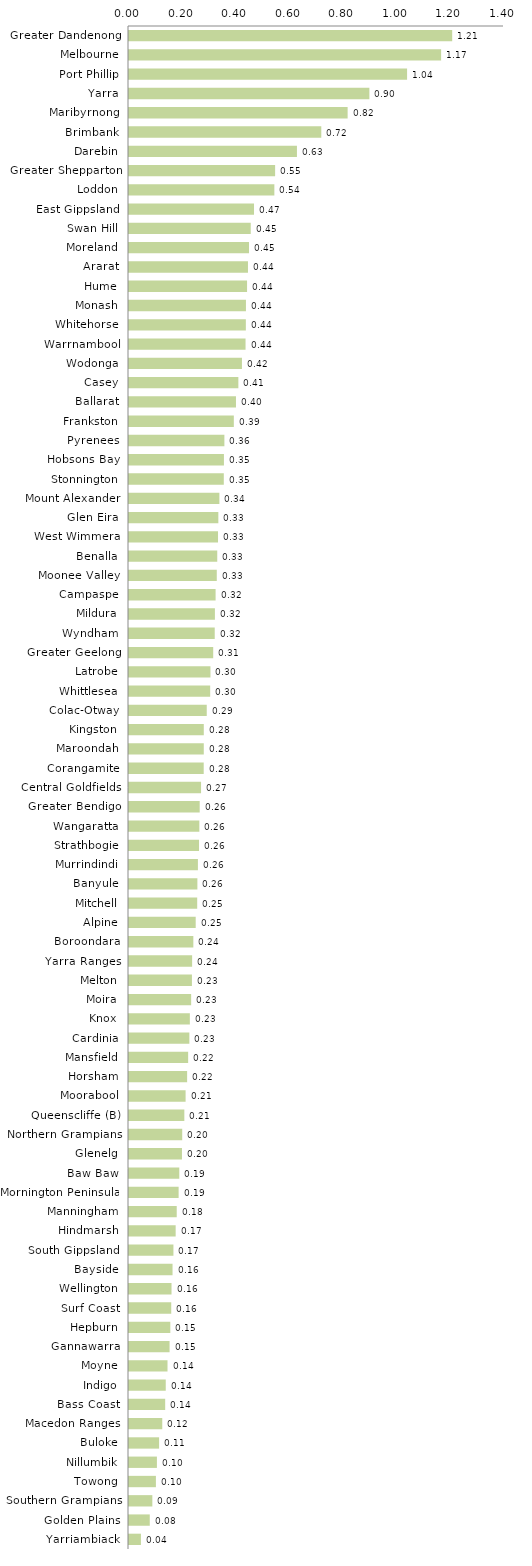
| Category | Series 0 |
|---|---|
| Greater Dandenong | 1.207 |
| Melbourne | 1.165 |
| Port Phillip | 1.038 |
| Yarra | 0.897 |
| Maribyrnong | 0.816 |
| Brimbank | 0.718 |
| Darebin | 0.627 |
| Greater Shepparton | 0.546 |
| Loddon | 0.543 |
| East Gippsland | 0.467 |
| Swan Hill | 0.454 |
| Moreland | 0.448 |
| Ararat | 0.444 |
| Hume | 0.441 |
| Monash | 0.437 |
| Whitehorse | 0.436 |
| Warrnambool | 0.435 |
| Wodonga | 0.422 |
| Casey | 0.408 |
| Ballarat | 0.399 |
| Frankston | 0.391 |
| Pyrenees | 0.356 |
| Hobsons Bay | 0.354 |
| Stonnington | 0.354 |
| Mount Alexander | 0.337 |
| Glen Eira | 0.334 |
| West Wimmera | 0.332 |
| Benalla | 0.329 |
| Moonee Valley | 0.328 |
| Campaspe | 0.323 |
| Mildura | 0.321 |
| Wyndham | 0.32 |
| Greater Geelong | 0.314 |
| Latrobe | 0.304 |
| Whittlesea | 0.303 |
| Colac-Otway | 0.29 |
| Kingston | 0.279 |
| Maroondah | 0.279 |
| Corangamite | 0.279 |
| Central Goldfields | 0.269 |
| Greater Bendigo | 0.264 |
| Wangaratta | 0.263 |
| Strathbogie | 0.261 |
| Murrindindi | 0.257 |
| Banyule | 0.255 |
| Mitchell | 0.255 |
| Alpine | 0.249 |
| Boroondara | 0.24 |
| Yarra Ranges | 0.236 |
| Melton | 0.235 |
| Moira | 0.232 |
| Knox | 0.227 |
| Cardinia | 0.225 |
| Mansfield | 0.221 |
| Horsham | 0.217 |
| Moorabool | 0.211 |
| Queenscliffe (B) | 0.207 |
| Northern Grampians | 0.199 |
| Glenelg | 0.198 |
| Baw Baw | 0.188 |
| Mornington Peninsula | 0.185 |
| Manningham | 0.178 |
| Hindmarsh | 0.174 |
| South Gippsland | 0.166 |
| Bayside | 0.163 |
| Wellington | 0.159 |
| Surf Coast | 0.158 |
| Hepburn | 0.154 |
| Gannawarra | 0.151 |
| Moyne | 0.144 |
| Indigo | 0.137 |
| Bass Coast | 0.135 |
| Macedon Ranges | 0.124 |
| Buloke | 0.112 |
| Nillumbik | 0.104 |
| Towong | 0.1 |
| Southern Grampians | 0.087 |
| Golden Plains | 0.078 |
| Yarriambiack | 0.045 |